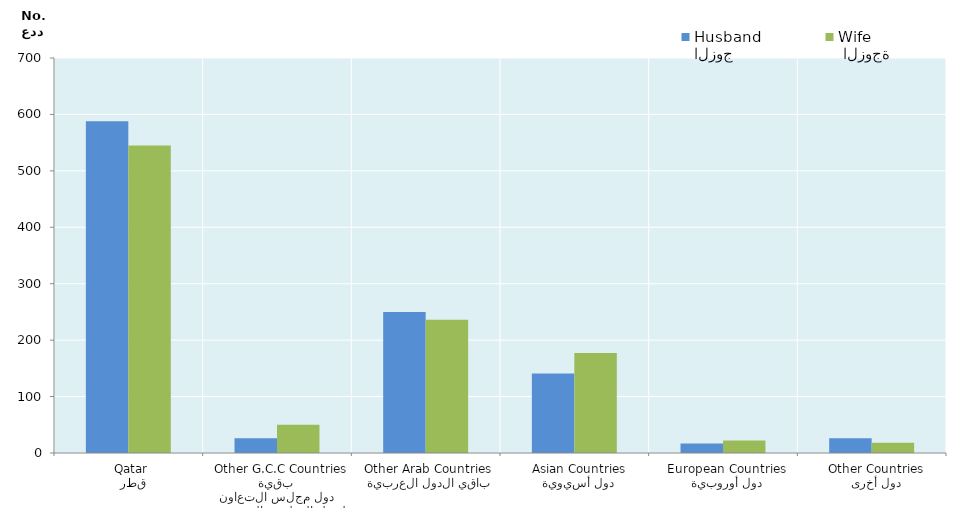
| Category | الزوج
Husband |  الزوجة
Wife |
|---|---|---|
|   قطر
 Qatar | 588 | 545 |
|  بقية دول مجلس التعاون لدول الخليج العربية
  Other G.C.C Countries | 26 | 50 |
|   باقي الدول العربية
 Other Arab Countries | 250 | 236 |
|   دول أسيوية
  Asian Countries | 141 | 177 |
|   دول أوروبية
  European Countries | 17 | 22 |
|   دول أخرى
  Other Countries | 26 | 18 |